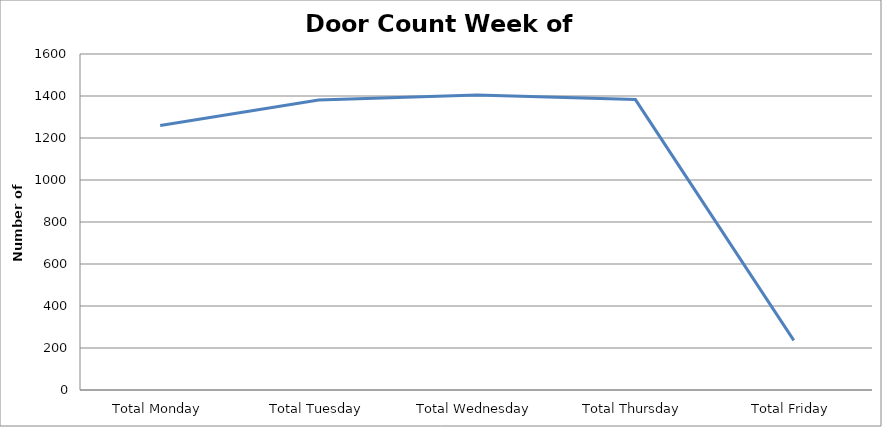
| Category | Series 0 |
|---|---|
| Total Monday | 1260 |
| Total Tuesday | 1381 |
| Total Wednesday | 1404.5 |
| Total Thursday | 1383 |
| Total Friday | 236 |